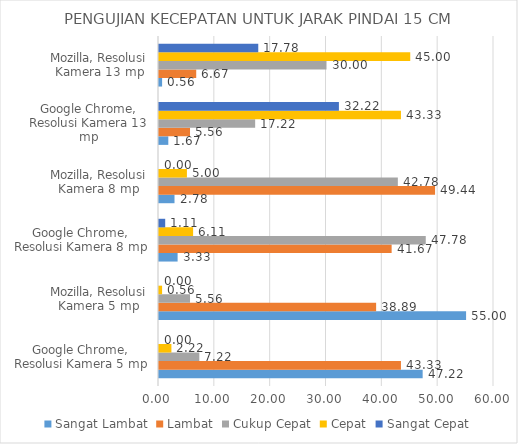
| Category | Sangat Lambat | Lambat | Cukup Cepat | Cepat | Sangat Cepat |
|---|---|---|---|---|---|
| Google Chrome, Resolusi Kamera 5 mp | 47.222 | 43.333 | 7.222 | 2.222 | 0 |
| Mozilla, Resolusi Kamera 5 mp | 55 | 38.889 | 5.556 | 0.556 | 0 |
| Google Chrome, Resolusi Kamera 8 mp | 3.333 | 41.667 | 47.778 | 6.111 | 1.111 |
| Mozilla, Resolusi Kamera 8 mp | 2.778 | 49.444 | 42.778 | 5 | 0 |
| Google Chrome, Resolusi Kamera 13 mp | 1.667 | 5.556 | 17.222 | 43.333 | 32.222 |
| Mozilla, Resolusi Kamera 13 mp | 0.556 | 6.667 | 30 | 45 | 17.778 |